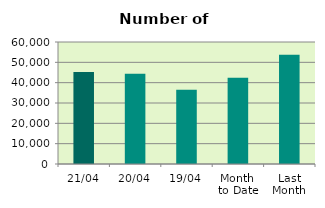
| Category | Series 0 |
|---|---|
| 21/04 | 45234 |
| 20/04 | 44332 |
| 19/04 | 36468 |
| Month 
to Date | 42379.846 |
| Last
Month | 53669.217 |